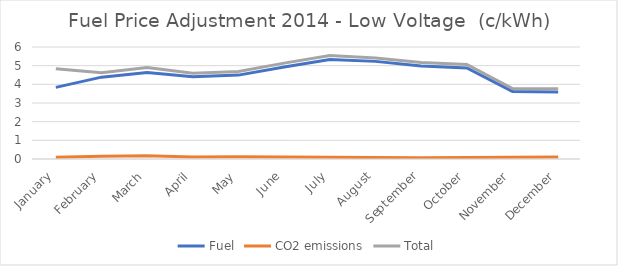
| Category | Fuel | CO2 emissions | Total |
|---|---|---|---|
| January | 3.838 | 0.096 | 4.838 |
| February | 4.385 | 0.152 | 4.621 |
| March | 4.632 | 0.177 | 4.903 |
| April | 4.405 | 0.111 | 4.595 |
| May | 4.494 | 0.117 | 4.691 |
| June | 4.928 | 0.106 | 5.135 |
| July | 5.33 | 0.095 | 5.543 |
| August | 5.23 | 0.074 | 5.417 |
| September | 4.982 | 0.073 | 5.166 |
| October | 4.873 | 0.084 | 5.065 |
| November | 3.62 | 0.095 | 3.771 |
| December | 3.583 | 0.108 | 3.763 |